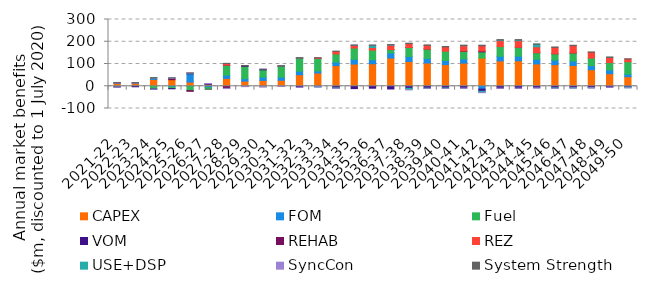
| Category | CAPEX | FOM | Fuel | VOM | REHAB | REZ | USE+DSP | SyncCon | System Strength |
|---|---|---|---|---|---|---|---|---|---|
| 2021-22 | 12.615 | 2.419 | -2.408 | -1.103 | 0 | 1.62 | 0 | -0.053 | 0.403 |
| 2022-23 | 12.038 | 2.308 | -0.323 | -1.985 | 0 | 1.546 | 0 | 0.083 | 0.384 |
| 2023-24 | 30.574 | 6.533 | -12.466 | -1.178 | 0 | 1.097 | 0 | -0.055 | 0.01 |
| 2024-25 | 29.479 | -3.765 | -6.734 | -0.69 | 6.799 | 0.291 | 0.066 | 0.208 | 0.183 |
| 2025-26 | 18.664 | 37.348 | -19.538 | 1.727 | -3.272 | 1.102 | 0.11 | 0.03 | 0.215 |
| 2026-27 | 7.634 | -5.823 | -7.374 | 2.93 | 0.755 | 0.338 | 0.505 | 0.179 | -0.004 |
| 2027-28 | 35.275 | 14.519 | 45.047 | 0.045 | -9.618 | 7.46 | 0 | -0.766 | 0.586 |
| 2028-29 | 22.952 | 11.032 | 55.774 | 2.536 | 0 | -0.707 | -0.297 | -0.851 | 0.292 |
| 2029-30 | 26.286 | 14.915 | 32.436 | 2.564 | -1.448 | -0.391 | -0.005 | -1.003 | 0.312 |
| 2030-31 | 26.724 | 14.201 | 48.739 | 1.082 | 0 | 0.097 | 0.014 | -0.821 | 0.137 |
| 2031-32 | 51.827 | 15.748 | 58.193 | -4.518 | 0.514 | 0.589 | 0.087 | -0.449 | 0.687 |
| 2032-33 | 59.41 | 9.262 | 56.667 | -2.014 | 0 | 2.318 | -0.796 | -0.635 | 0.24 |
| 2033-34 | 92.757 | 15.919 | 36.61 | -7.289 | -0.164 | 11.256 | -1.674 | -0.436 | 1.19 |
| 2034-35 | 99.775 | 21.224 | 50.671 | -10.596 | 0 | 11.8 | 0.399 | 0.133 | 1.327 |
| 2035-36 | 101.042 | 17.769 | 43.479 | -8.866 | 0 | 11.885 | 9.717 | 0.003 | 1.286 |
| 2036-37 | 127.032 | 22.708 | 15.21 | -12.245 | 0.17 | 19.648 | 0.685 | 0.08 | 1.619 |
| 2037-38 | 111.36 | 22.644 | 40.132 | -9.172 | 0 | 17.405 | -6.294 | -0.024 | 2.003 |
| 2038-39 | 104.337 | 20.897 | 42.019 | -9.053 | 0 | 16.504 | -0.04 | -0.078 | 1.838 |
| 2039-40 | 97.135 | 18.7 | 41.771 | -7.684 | 0 | 19.224 | -1.967 | -0.105 | 1.724 |
| 2040-41 | 104.029 | 18.652 | 34.657 | -8.067 | 1.542 | 23.386 | 0.587 | -0.206 | 1.795 |
| 2041-42 | 126.738 | -12.877 | 27.595 | -9.721 | 4.244 | 23.508 | -5.894 | -0.098 | 2.432 |
| 2042-43 | 113.993 | 20.814 | 43.518 | -8.529 | 0 | 26.677 | 2.614 | -0.16 | 2.035 |
| 2043-44 | 114.437 | 20.745 | 39.952 | -8.349 | 0.026 | 29.67 | 2.743 | -0.085 | 2.096 |
| 2044-45 | 100.448 | 20.911 | 29.576 | -7.05 | 0 | 26.665 | 10.79 | -0.094 | 1.954 |
| 2045-46 | 96.942 | 20.814 | 28.397 | -7.225 | 0 | 28.371 | -1.919 | -0.052 | 1.878 |
| 2046-47 | 93.418 | 19.845 | 36.497 | -6.959 | 0 | 32.657 | -0.747 | -0.047 | 1.864 |
| 2047-48 | 74.197 | 18.688 | 33.955 | -4.919 | -1.935 | 25.823 | -0.099 | -0.134 | 1.47 |
| 2048-49 | 56.254 | 16.763 | 33.295 | -4.278 | 0 | 23.511 | 0.007 | -0.133 | 1.401 |
| 2049-50 | 42.798 | 11.499 | 55.935 | -3.442 | 0 | 12.293 | -3.383 | -0.084 | 0.594 |